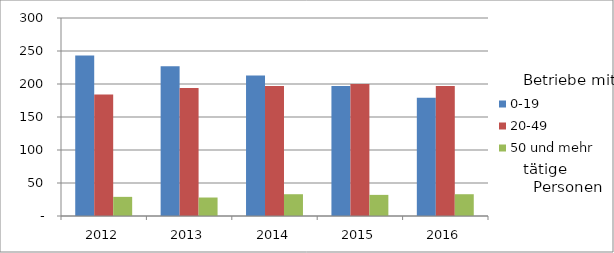
| Category | 0-19 | 20-49 | 50 und mehr |
|---|---|---|---|
| 2012.0 | 243 | 184 | 29 |
| 2013.0 | 227 | 194 | 28 |
| 2014.0 | 213 | 197 | 33 |
| 2015.0 | 197 | 200 | 32 |
| 2016.0 | 179 | 197 | 33 |